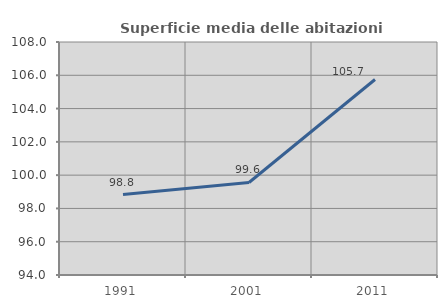
| Category | Superficie media delle abitazioni occupate |
|---|---|
| 1991.0 | 98.835 |
| 2001.0 | 99.559 |
| 2011.0 | 105.748 |